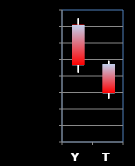
| Category | Series 0 | Series 1 | Series 2 | Series 3 |
|---|---|---|---|---|
| Y | 97.1 | 97.49 | 94.21 | 94.66 |
| T | 94.72 | 94.92 | 92.63 | 92.96 |